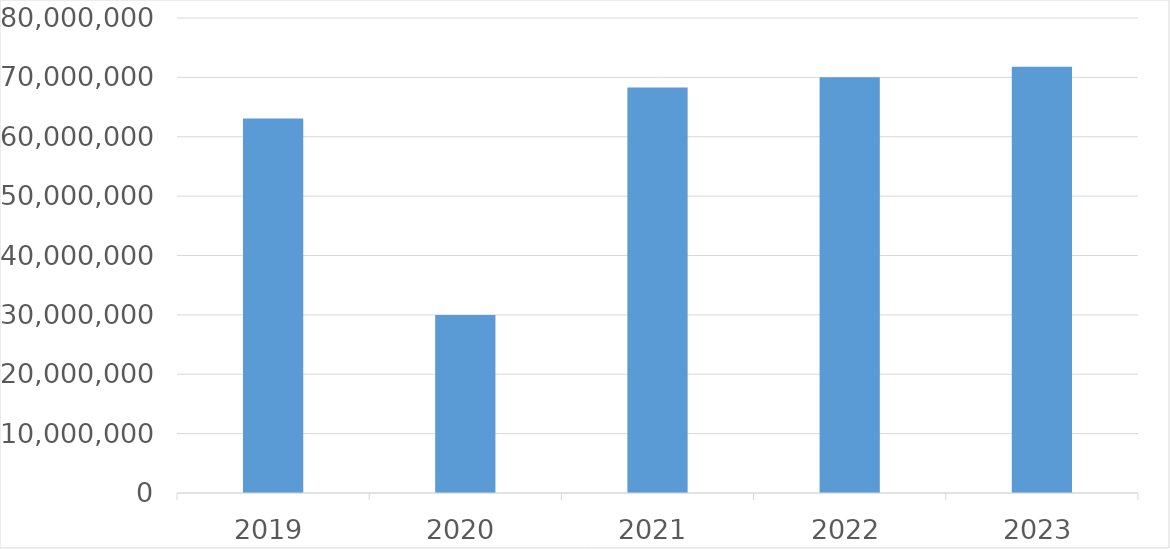
| Category | Series 0 |
|---|---|
| 2019 | 63075063 |
| 2020 | 30000000 |
| 2021 | 68287928 |
| 2022 | 70026281 |
| 2023 | 71802829 |